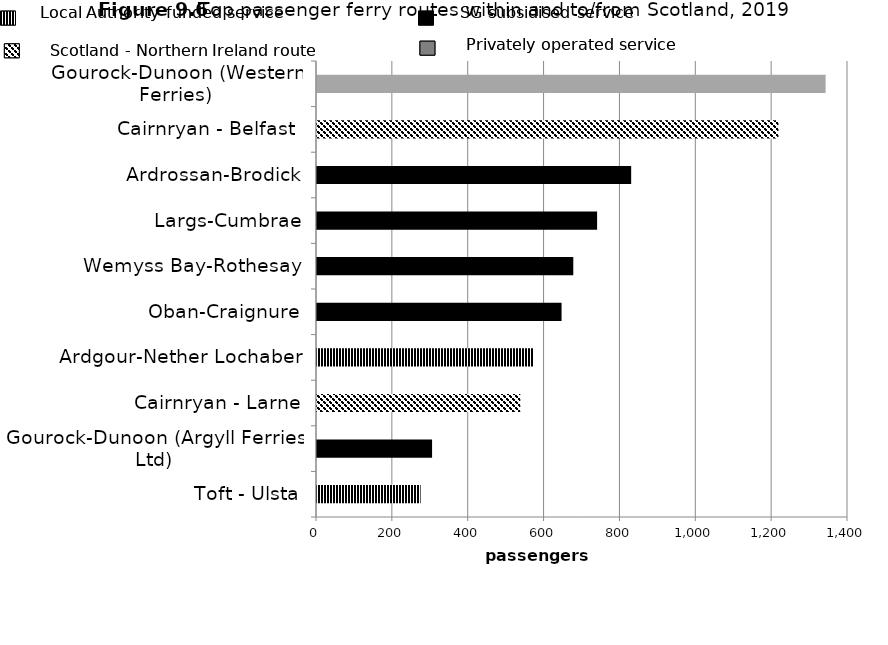
| Category | Series 0 |
|---|---|
| Toft - Ulsta | 273.2 |
| Gourock-Dunoon (Argyll Ferries Ltd) | 303.4 |
| Cairnryan - Larne | 536.065 |
| Ardgour-Nether Lochaber | 572 |
| Oban-Craignure | 644.8 |
| Wemyss Bay-Rothesay | 675.7 |
| Largs-Cumbrae | 738.5 |
| Ardrossan-Brodick | 828.3 |
| Cairnryan - Belfast  | 1216.657 |
| Gourock-Dunoon (Western Ferries) | 1341 |